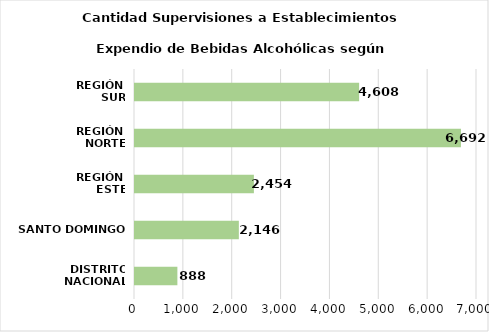
| Category | Series 0 |
|---|---|
| DISTRITO NACIONAL | 888 |
| SANTO DOMINGO | 2146 |
| REGIÓN 
ESTE | 2454 |
| REGIÓN 
NORTE | 6692 |
| REGIÓN 
SUR | 4608 |